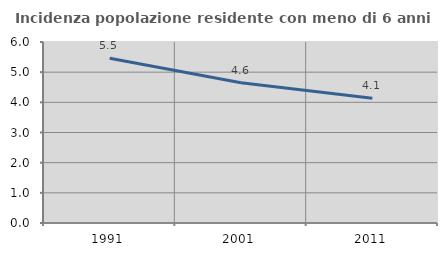
| Category | Incidenza popolazione residente con meno di 6 anni |
|---|---|
| 1991.0 | 5.46 |
| 2001.0 | 4.649 |
| 2011.0 | 4.139 |